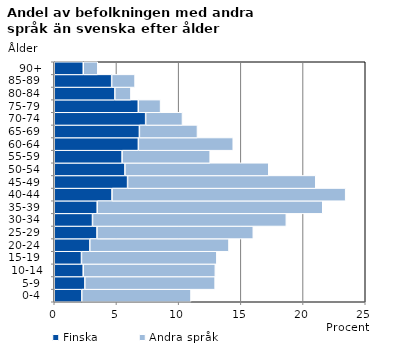
| Category | Finska | Andra språk |
|---|---|---|
|   0-4  | 2.213 | 8.779 |
|   5-9  | 2.458 | 10.474 |
| 10-14 | 2.328 | 10.619 |
| 15-19  | 2.188 | 10.881 |
| 20-24  | 2.86 | 11.186 |
| 25-29  | 3.439 | 12.561 |
| 30-34  | 3.075 | 15.581 |
| 35-39  | 3.454 | 18.131 |
| 40-44  | 4.645 | 18.781 |
| 45-49  | 5.895 | 15.128 |
| 50-54  | 5.681 | 11.564 |
| 55-59  | 5.455 | 7.078 |
| 60-64  | 6.762 | 7.626 |
| 65-69  | 6.844 | 4.668 |
| 70-74  | 7.347 | 2.96 |
| 75-79  | 6.754 | 1.793 |
| 80-84  | 4.871 | 1.292 |
| 85-89  | 4.615 | 1.88 |
| 90+ | 2.332 | 1.166 |